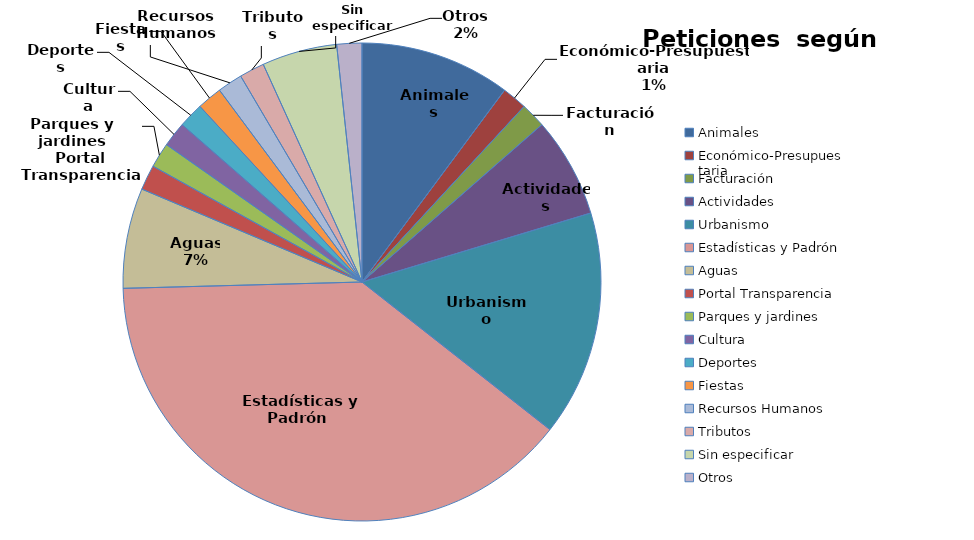
| Category | Series 0 |
|---|---|
| Animales | 0.102 |
| Económico-Presupuestaria | 0.017 |
| Facturación | 0.017 |
| Actividades | 0.068 |
| Urbanismo | 0.153 |
| Estadísticas y Padrón  | 0.39 |
| Aguas | 0.068 |
| Portal Transparencia | 0.017 |
| Parques y jardines | 0.017 |
| Cultura | 0.017 |
| Deportes | 0.017 |
| Fiestas | 0.017 |
| Recursos Humanos | 0.017 |
| Tributos | 0.017 |
| Sin especificar | 0.051 |
| Otros | 0.017 |